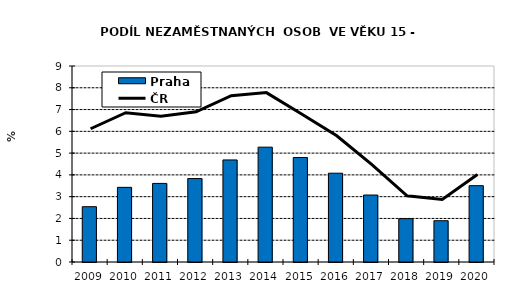
| Category | Praha |
|---|---|
| 2009.0 | 2.539 |
| 2010.0 | 3.428 |
| 2011.0 | 3.609 |
| 2012.0 | 3.833 |
| 2013.0 | 4.687 |
| 2014.0 | 5.273 |
| 2015.0 | 4.799 |
| 2016.0 | 4.077 |
| 2017.0 | 3.075 |
| 2018.0 | 1.99 |
| 2019.0 | 1.895 |
| 2020.0 | 3.505 |